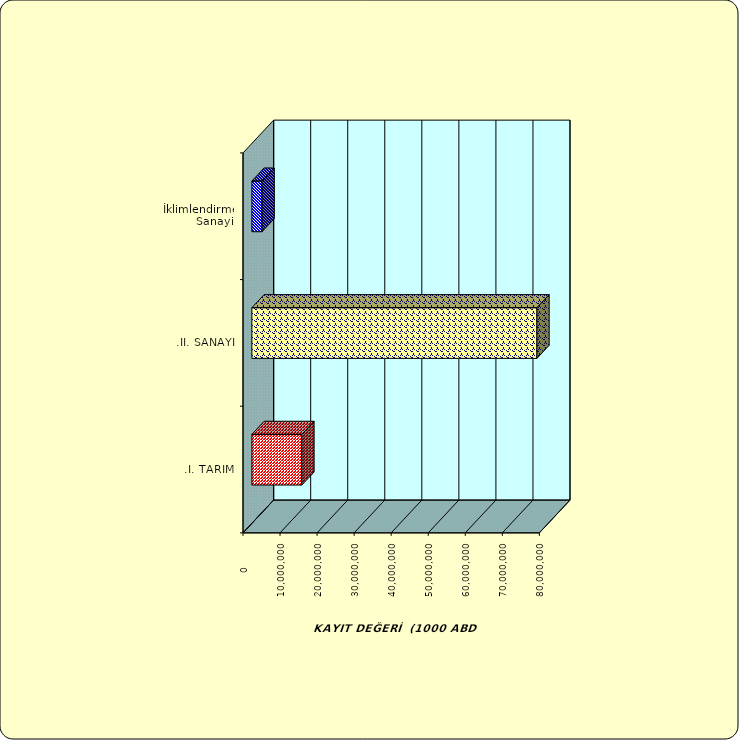
| Category | Series 0 |
|---|---|
| .I. TARIM | 13495023.967 |
| .II. SANAYİ | 76947535.625 |
|  İklimlendirme Sanayii | 2743542.494 |